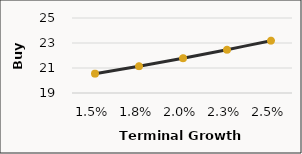
| Category | Terminal Growth Rates vs. Buy Prices |
|---|---|
| 0.015000000000000001 | 20.547 |
| 0.0175 | 21.147 |
| 0.02 | 21.784 |
| 0.0225 | 22.463 |
| 0.024999999999999998 | 23.187 |